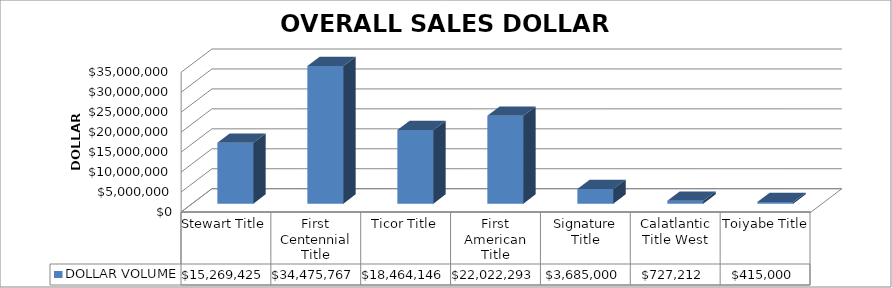
| Category | DOLLAR VOLUME |
|---|---|
| Stewart Title | 15269424.71 |
| First Centennial Title | 34475767 |
| Ticor Title | 18464146 |
| First American Title | 22022293 |
| Signature Title | 3685000 |
| Calatlantic Title West | 727212 |
| Toiyabe Title | 415000 |